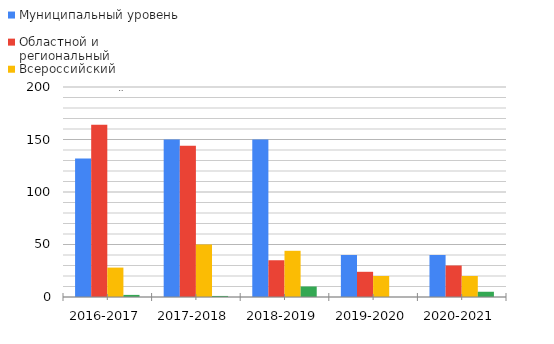
| Category | Муниципальный уровень | Областной и региональный  | Всероссийский  | Международный  |
|---|---|---|---|---|
| 2016-2017 | 132 | 164 | 28 | 2 |
| 2017-2018 | 150 | 144 | 50 | 1 |
| 2018-2019 | 150 | 35 | 44 | 10 |
| 2019-2020 | 40 | 24 | 20 | 0 |
| 2020-2021 | 40 | 30 | 20 | 5 |